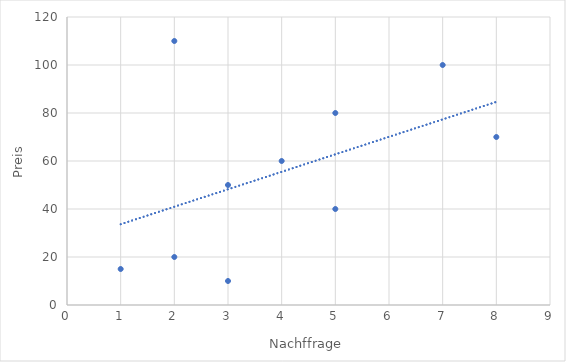
| Category | Series 0 |
|---|---|
| 3.0 | 50 |
| 2.0 | 110 |
| 4.0 | 60 |
| 5.0 | 80 |
| 8.0 | 70 |
| 7.0 | 100 |
| 5.0 | 40 |
| 3.0 | 10 |
| 2.0 | 20 |
| 1.0 | 15 |